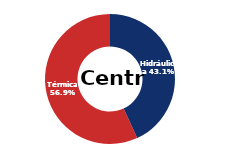
| Category | Centro |
|---|---|
| Eólica | 0 |
| Hidráulica | 1621.212 |
| Solar | 0.007 |
| Térmica | 2136.914 |